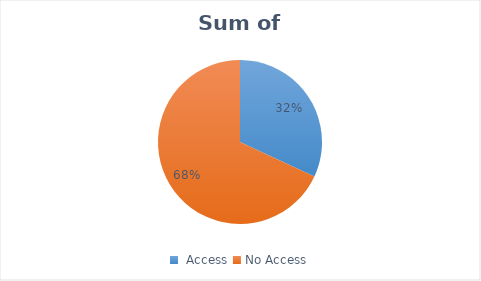
| Category | Sum of HRP2 |
|---|---|
|  Access  | 45023 |
| No Access | 95998 |